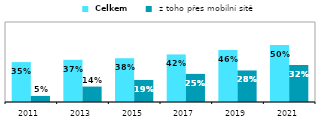
| Category |  Celkem |  z toho přes mobilní sítě |
|---|---|---|
| 2011 | 0.349 | 0.053 |
| 2013 | 0.369 | 0.135 |
| 2015 | 0.383 | 0.193 |
| 2017 | 0.416 | 0.246 |
| 2019 | 0.456 | 0.276 |
| 2021 | 0.498 | 0.324 |